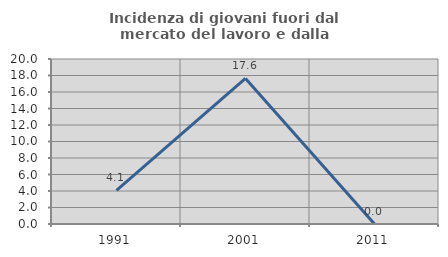
| Category | Incidenza di giovani fuori dal mercato del lavoro e dalla formazione  |
|---|---|
| 1991.0 | 4.082 |
| 2001.0 | 17.647 |
| 2011.0 | 0 |